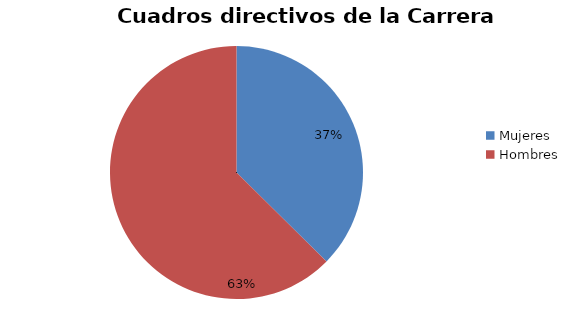
| Category | Series 0 |
|---|---|
| Mujeres | 46 |
| Hombres | 77 |